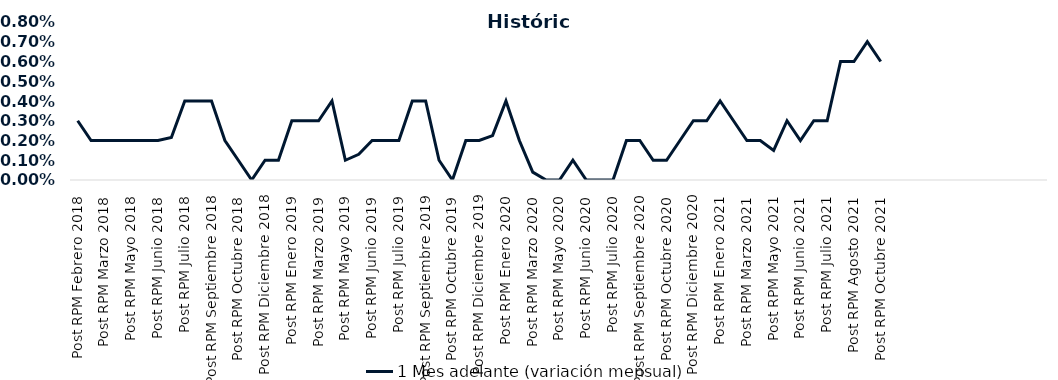
| Category | 1 Mes adelante (variación mensual) |
|---|---|
| Post RPM Febrero 2018 | 0.003 |
| Pre RPM Marzo 2018 | 0.002 |
| Post RPM Marzo 2018 | 0.002 |
| Pre RPM Mayo 2018 | 0.002 |
| Post RPM Mayo 2018 | 0.002 |
| Pre RPM Junio 2018 | 0.002 |
| Post RPM Junio 2018 | 0.002 |
| Pre RPM Julio 2018 | 0.002 |
| Post RPM Julio 2018 | 0.004 |
| Pre RPM Septiembre 2018 | 0.004 |
| Post RPM Septiembre 2018 | 0.004 |
| Pre RPM Octubre 2018 | 0.002 |
| Post RPM Octubre 2018 | 0.001 |
| Pre RPM Diciembre 2018 | 0 |
| Post RPM Diciembre 2018 | 0.001 |
| Pre RPM Enero 2019 | 0.001 |
| Post RPM Enero 2019 | 0.003 |
| Pre RPM Marzo 2019 | 0.003 |
| Post RPM Marzo 2019 | 0.003 |
| Pre RPM Mayo 2019 | 0.004 |
| Post RPM Mayo 2019 | 0.001 |
| Pre RPM Junio 2019 | 0.001 |
| Post RPM Junio 2019 | 0.002 |
| Pre RPM Julio 2019 | 0.002 |
| Post RPM Julio 2019 | 0.002 |
| Pre RPM Septiembre 2019 | 0.004 |
| Post RPM Septiembre 2019 | 0.004 |
| Pre RPM Octubre 2019 | 0.001 |
| Post RPM Octubre 2019 | 0 |
| Pre RPM Diciembre 2019 | 0.002 |
| Post RPM Diciembre 2019 | 0.002 |
| Pre RPM Enero 2020 | 0.002 |
| Post RPM Enero 2020 | 0.004 |
| Pre RPM Marzo 2020 | 0.002 |
| Post RPM Marzo 2020 | 0 |
| Pre RPM Mayo 2020 | 0 |
| Post RPM Mayo 2020 | 0 |
| Pre RPM Junio 2020 | 0.001 |
| Post RPM Junio 2020 | 0 |
| Pre RPM Julio 2020 | 0 |
| Post RPM Julio 2020 | 0 |
| Pre RPM Septiembre 2020 | 0.002 |
| Post RPM Septiembre 2020 | 0.002 |
| Pre RPM Octubre 2020 | 0.001 |
| Post RPM Octubre 2020 | 0.001 |
| Pre RPM Diciembre 2020 | 0.002 |
| Post RPM Diciembre 2020 | 0.003 |
| Pre RPM Enero 2021 | 0.003 |
| Post RPM Enero 2021 | 0.004 |
| Pre RPM Marzo 2021 | 0.003 |
| Post RPM Marzo 2021 | 0.002 |
| Pre RPM Mayo 2021 | 0.002 |
| Post RPM Mayo 2021 | 0.002 |
| Pre RPM Junio 2021 | 0.003 |
| Post RPM Junio 2021 | 0.002 |
| Pre RPM Julio 2021 | 0.003 |
| Post RPM Julio 2021 | 0.003 |
| Pre RPM Agosto 2021 | 0.006 |
| Post RPM Agosto 2021 | 0.006 |
| Pre RPM Octubre 2021 | 0.007 |
| Post RPM Octubre 2021 | 0.006 |